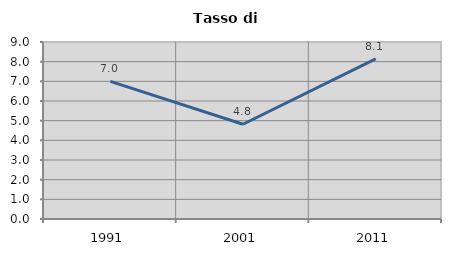
| Category | Tasso di disoccupazione   |
|---|---|
| 1991.0 | 7 |
| 2001.0 | 4.819 |
| 2011.0 | 8.14 |